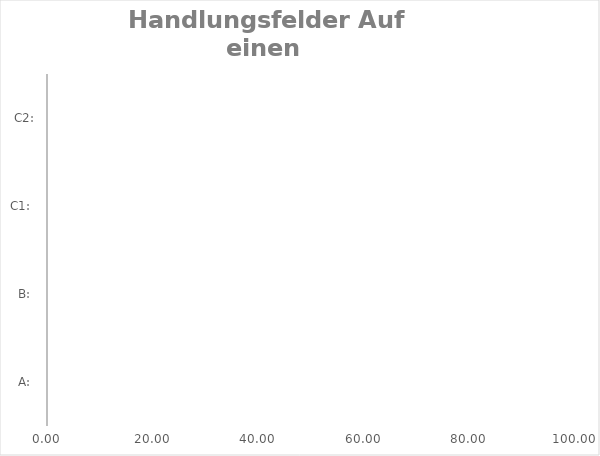
| Category | Series 0 |
|---|---|
| A:  | 0 |
| B:  | 0 |
| C1:  | 0 |
| C2: | 0 |